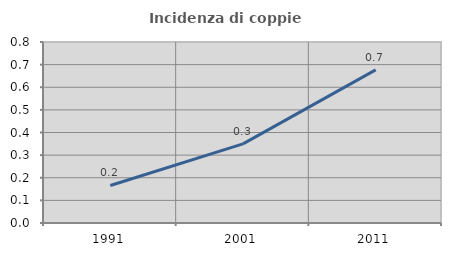
| Category | Incidenza di coppie miste |
|---|---|
| 1991.0 | 0.166 |
| 2001.0 | 0.35 |
| 2011.0 | 0.677 |